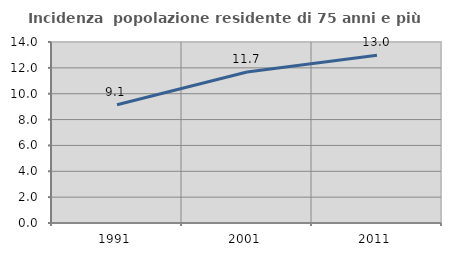
| Category | Incidenza  popolazione residente di 75 anni e più |
|---|---|
| 1991.0 | 9.141 |
| 2001.0 | 11.676 |
| 2011.0 | 12.967 |